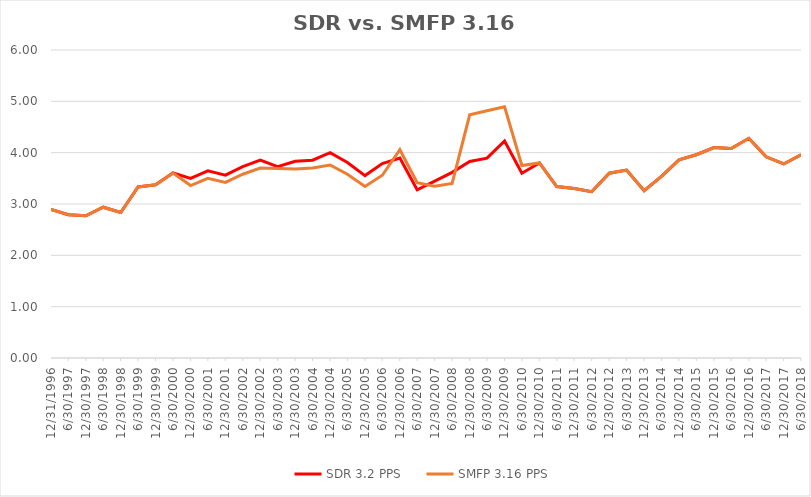
| Category | SDR 3.2 PPS | SMFP 3.16 PPS |
|---|---|---|
| 12/31/96 | 2.896 | 2.896 |
| 6/30/97 | 2.792 | 2.792 |
| 12/31/97 | 2.771 | 2.771 |
| 6/30/98 | 2.938 | 2.938 |
| 12/31/98 | 2.833 | 2.833 |
| 6/30/99 | 3.333 | 3.333 |
| 12/31/99 | 3.375 | 3.375 |
| 6/30/00 | 3.604 | 3.604 |
| 12/31/00 | 3.5 | 3.36 |
| 6/30/01 | 3.646 | 3.5 |
| 12/31/01 | 3.562 | 3.42 |
| 6/30/02 | 3.729 | 3.58 |
| 12/31/02 | 3.854 | 3.7 |
| 6/30/03 | 3.729 | 3.692 |
| 12/31/03 | 3.833 | 3.68 |
| 6/30/04 | 3.854 | 3.7 |
| 12/31/04 | 4 | 3.76 |
| 6/30/05 | 3.809 | 3.58 |
| 12/31/05 | 3.553 | 3.34 |
| 6/30/06 | 3.787 | 3.56 |
| 12/31/06 | 3.894 | 4.057 |
| 6/30/07 | 3.277 | 3.414 |
| 12/31/07 | 3.447 | 3.344 |
| 6/30/08 | 3.617 | 3.4 |
| 12/31/08 | 3.83 | 4.737 |
| 6/30/09 | 3.894 | 4.816 |
| 12/31/09 | 4.227 | 4.895 |
| 6/30/10 | 3.6 | 3.75 |
| 12/31/10 | 3.8 | 3.8 |
| 6/30/11 | 3.34 | 3.34 |
| 12/31/11 | 3.3 | 3.3 |
| 6/30/12 | 3.24 | 3.24 |
| 12/31/12 | 3.6 | 3.6 |
| 6/30/13 | 3.66 | 3.66 |
| 12/31/13 | 3.26 | 3.26 |
| 6/30/14 | 3.54 | 3.54 |
| 12/31/14 | 3.86 | 3.86 |
| 6/30/15 | 3.96 | 3.96 |
| 12/31/15 | 4.1 | 4.1 |
| 6/30/16 | 4.08 | 4.08 |
| 12/31/16 | 4.28 | 4.28 |
| 6/30/17 | 3.92 | 3.92 |
| 12/31/17 | 3.78 | 3.78 |
| 6/30/18 | 3.96 | 3.96 |